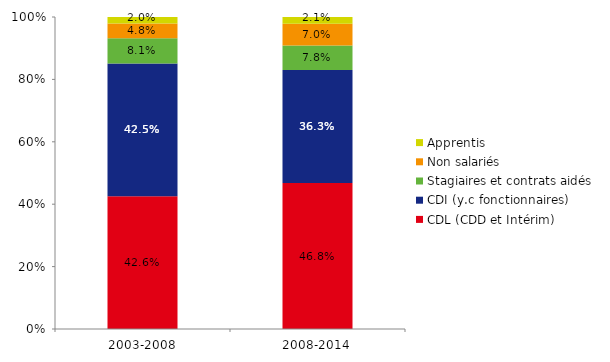
| Category | CDL (CDD et Intérim) | CDI (y.c fonctionnaires) | Stagiaires et contrats aidés | Non salariés | Apprentis |
|---|---|---|---|---|---|
| 2003-2008 | 0.426 | 0.425 | 0.081 | 0.048 | 0.02 |
| 2008-2014 | 0.468 | 0.363 | 0.078 | 0.07 | 0.021 |